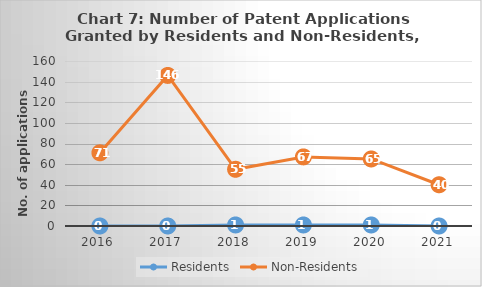
| Category | Residents | Non-Residents |
|---|---|---|
| 2016.0 | 0 | 71 |
| 2017.0 | 0 | 146 |
| 2018.0 | 1 | 55 |
| 2019.0 | 1 | 67 |
| 2020.0 | 1 | 65 |
| 2021.0 | 0 | 40 |